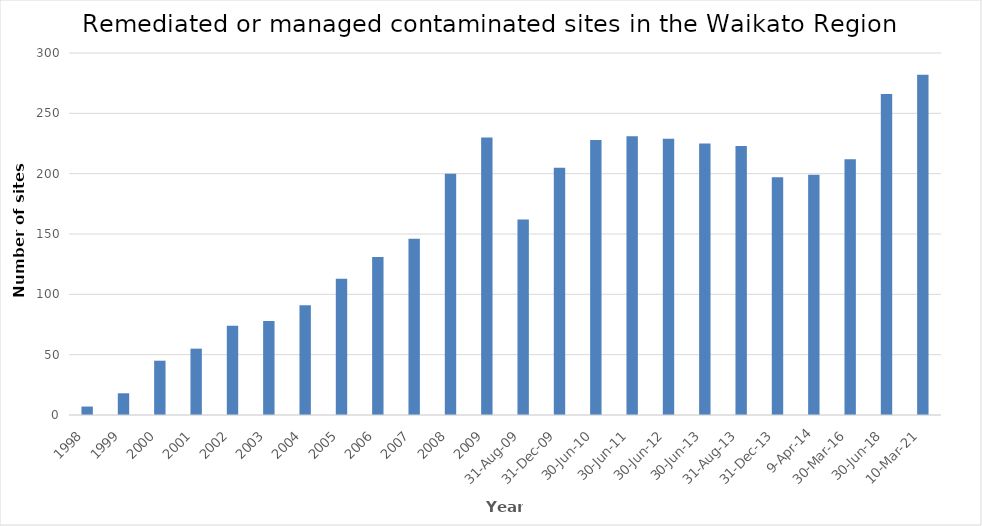
| Category | Series 0 |
|---|---|
| 1998.0 | 7 |
| 1999.0 | 18 |
| 2000.0 | 45 |
| 2001.0 | 55 |
| 2002.0 | 74 |
| 2003.0 | 78 |
| 2004.0 | 91 |
| 2005.0 | 113 |
| 2006.0 | 131 |
| 2007.0 | 146 |
| 2008.0 | 200 |
| 2009.0 | 230 |
| 40056.0 | 162 |
| 40178.0 | 205 |
| 40359.0 | 228 |
| 40724.0 | 231 |
| 41090.0 | 229 |
| 41455.0 | 225 |
| 41517.0 | 223 |
| 41639.0 | 197 |
| 41738.0 | 199 |
| 42459.0 | 212 |
| 43281.0 | 266 |
| 44265.0 | 282 |